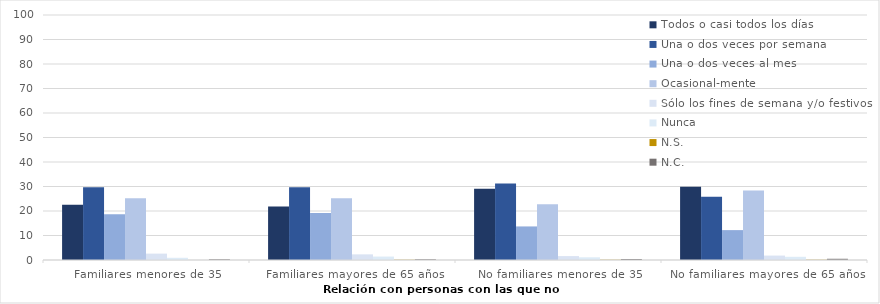
| Category | Todos o casi todos los días | Una o dos veces por semana | Una o dos veces al mes | Ocasional-mente | Sólo los fines de semana y/o festivos | Nunca | N.S. | N.C. |
|---|---|---|---|---|---|---|---|---|
| Familiares menores de 35 | 22.6 | 29.7 | 18.7 | 25.2 | 2.6 | 0.9 | 0 | 0.3 |
| Familiares mayores de 65 años | 21.8 | 29.7 | 19.2 | 25.2 | 2.3 | 1.4 | 0.1 | 0.3 |
| No familiares menores de 35 | 29.1 | 31.2 | 13.7 | 22.8 | 1.6 | 1.1 | 0.1 | 0.4 |
| No familiares mayores de 65 años | 29.9 | 25.8 | 12.2 | 28.4 | 1.8 | 1.3 | 0.1 | 0.5 |